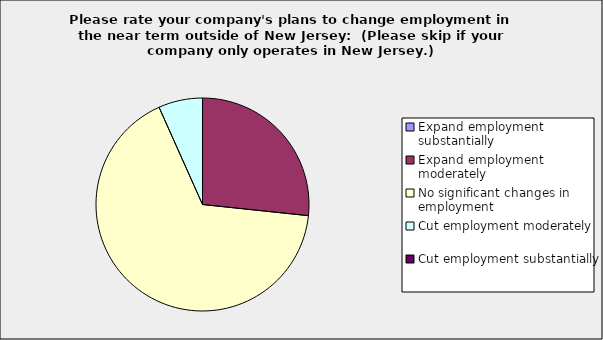
| Category | Series 0 |
|---|---|
| Expand employment substantially | 0 |
| Expand employment moderately | 0.267 |
| No significant changes in employment | 0.667 |
| Cut employment moderately | 0.067 |
| Cut employment substantially | 0 |